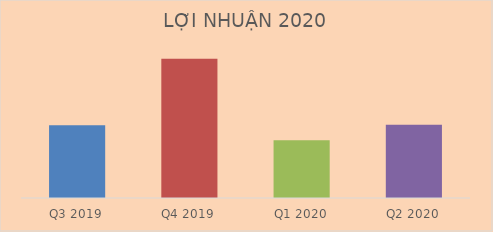
| Category | Doanh thu thuần |
|---|---|
| Q3 2019 | 141564647080 |
| Q4 2019 | 161258616106 |
| Q1 2020 | 137088278079 |
| Q2 2020 | 141704167852 |